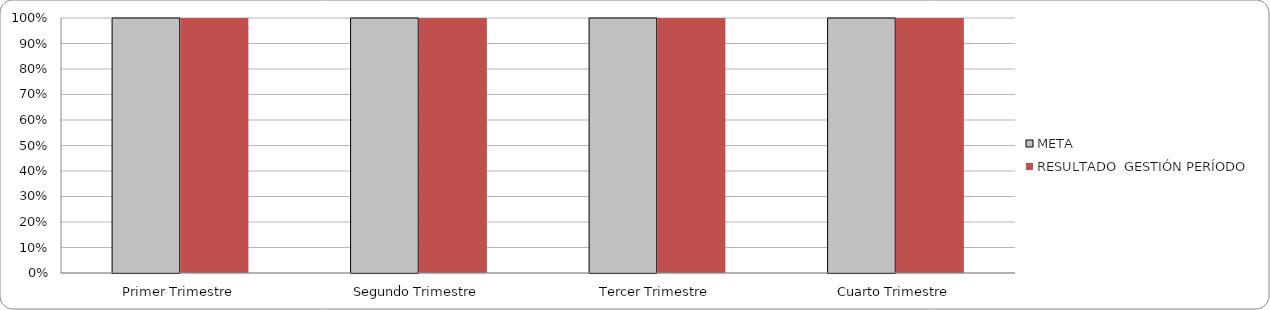
| Category | META | RESULTADO  GESTIÓN PERÍODO |
|---|---|---|
| Primer Trimestre | 1 | 1 |
| Segundo Trimestre | 1 | 1 |
| Tercer Trimestre | 1 | 1 |
| Cuarto Trimestre | 1 | 1 |